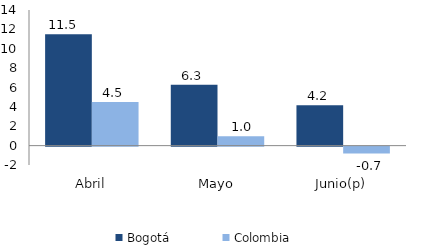
| Category | Bogotá | Colombia |
|---|---|---|
| Abril | 11.501 | 4.5 |
| Mayo | 6.287 | 0.975 |
| Junio(p) | 4.173 | -0.699 |